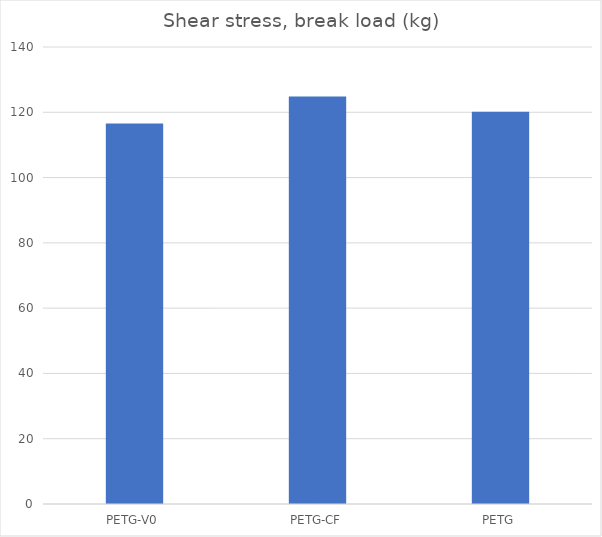
| Category | Break kg |
|---|---|
| PETG-V0 | 116.6 |
| PETG-CF | 124.8 |
| PETG | 120.2 |